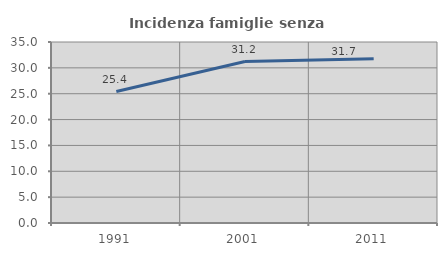
| Category | Incidenza famiglie senza nuclei |
|---|---|
| 1991.0 | 25.412 |
| 2001.0 | 31.217 |
| 2011.0 | 31.744 |